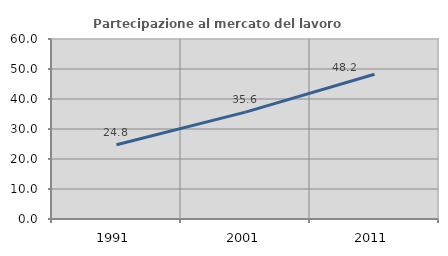
| Category | Partecipazione al mercato del lavoro  femminile |
|---|---|
| 1991.0 | 24.757 |
| 2001.0 | 35.616 |
| 2011.0 | 48.246 |